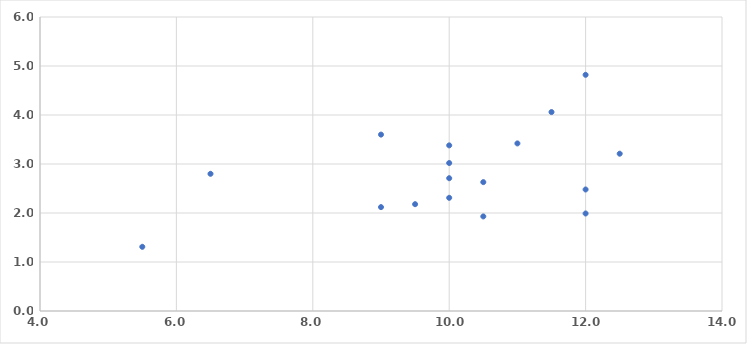
| Category | Series 0 |
|---|---|
| 10.0 | 2.71 |
| 10.0 | 3.02 |
| 11.0 | 3.42 |
| 9.0 | 2.12 |
| 12.0 | 2.48 |
| 10.0 | 2.31 |
| 12.0 | 1.99 |
| 9.5 | 2.18 |
| 10.5 | 1.93 |
| 12.0 | 4.82 |
| 10.0 | 3.38 |
| 12.5 | 3.21 |
| 9.0 | 3.6 |
| 6.5 | 2.8 |
| 5.5 | 1.31 |
| 11.5 | 4.06 |
| 10.5 | 2.63 |